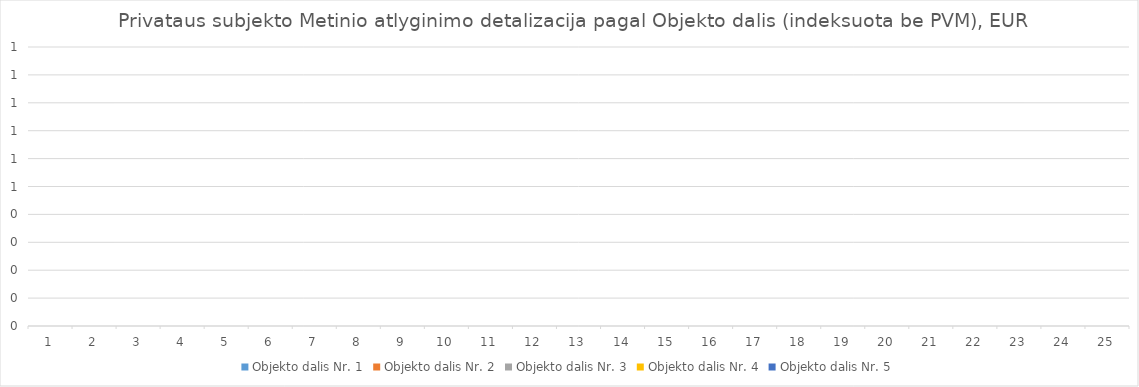
| Category | Objekto dalis Nr. 1 | Objekto dalis Nr. 2 | Objekto dalis Nr. 3 | Objekto dalis Nr. 4 | Objekto dalis Nr. 5 |
|---|---|---|---|---|---|
| 0 | 0 | 0 | 0 | 0 | 0 |
| 1 | 0 | 0 | 0 | 0 | 0 |
| 2 | 0 | 0 | 0 | 0 | 0 |
| 3 | 0 | 0 | 0 | 0 | 0 |
| 4 | 0 | 0 | 0 | 0 | 0 |
| 5 | 0 | 0 | 0 | 0 | 0 |
| 6 | 0 | 0 | 0 | 0 | 0 |
| 7 | 0 | 0 | 0 | 0 | 0 |
| 8 | 0 | 0 | 0 | 0 | 0 |
| 9 | 0 | 0 | 0 | 0 | 0 |
| 10 | 0 | 0 | 0 | 0 | 0 |
| 11 | 0 | 0 | 0 | 0 | 0 |
| 12 | 0 | 0 | 0 | 0 | 0 |
| 13 | 0 | 0 | 0 | 0 | 0 |
| 14 | 0 | 0 | 0 | 0 | 0 |
| 15 | 0 | 0 | 0 | 0 | 0 |
| 16 | 0 | 0 | 0 | 0 | 0 |
| 17 | 0 | 0 | 0 | 0 | 0 |
| 18 | 0 | 0 | 0 | 0 | 0 |
| 19 | 0 | 0 | 0 | 0 | 0 |
| 20 | 0 | 0 | 0 | 0 | 0 |
| 21 | 0 | 0 | 0 | 0 | 0 |
| 22 | 0 | 0 | 0 | 0 | 0 |
| 23 | 0 | 0 | 0 | 0 | 0 |
| 24 | 0 | 0 | 0 | 0 | 0 |